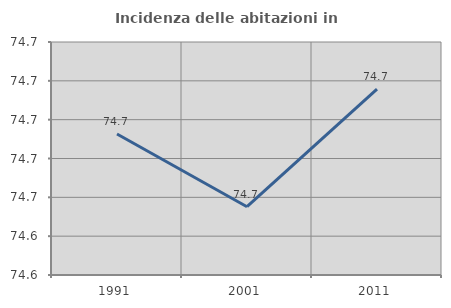
| Category | Incidenza delle abitazioni in proprietà  |
|---|---|
| 1991.0 | 74.693 |
| 2001.0 | 74.655 |
| 2011.0 | 74.716 |